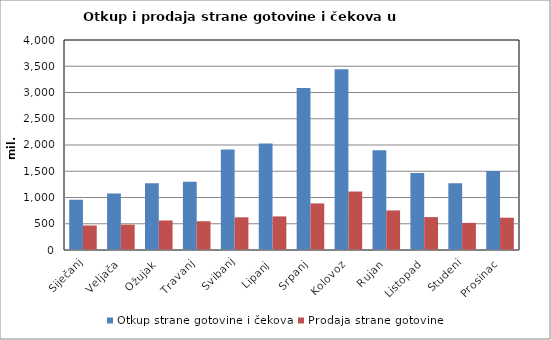
| Category | Otkup strane gotovine i čekova  | Prodaja strane gotovine  |
|---|---|---|
| Siječanj | 957330421 | 466848800 |
| Veljača | 1076056200 | 483397581 |
| Ožujak | 1272624289 | 561829302 |
| Travanj | 1298895813 | 547876125 |
| Svibanj | 1912661676 | 622833727 |
| Lipanj | 2028016944 | 639920495 |
| Srpanj | 3086192347 | 887325683 |
| Kolovoz | 3441410667 | 1113442867 |
| Rujan | 1900515242 | 753538954 |
| Listopad | 1468983122 | 626270860 |
| Studeni | 1273093298 | 516302806 |
| Prosinac | 1504206833 | 615385360 |